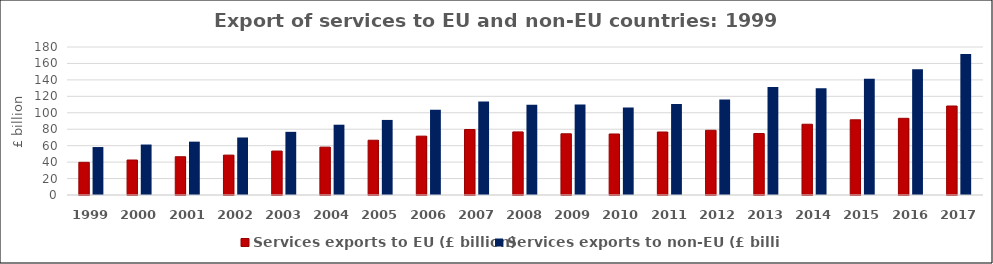
| Category | Services exports to EU (£ billion) | Services exports to non-EU (£ billion) |
|---|---|---|
| 1999.0 | 39.731 | 58.327 |
| 2000.0 | 42.542 | 61.381 |
| 2001.0 | 46.536 | 64.877 |
| 2002.0 | 48.508 | 69.941 |
| 2003.0 | 53.45 | 76.819 |
| 2004.0 | 58.214 | 85.487 |
| 2005.0 | 66.605 | 91.305 |
| 2006.0 | 71.579 | 103.783 |
| 2007.0 | 79.656 | 113.626 |
| 2008.0 | 76.702 | 109.875 |
| 2009.0 | 74.446 | 109.984 |
| 2010.0 | 74.198 | 106.394 |
| 2011.0 | 76.609 | 110.691 |
| 2012.0 | 78.743 | 116.275 |
| 2013.0 | 74.744 | 131.291 |
| 2014.0 | 86.052 | 129.689 |
| 2015.0 | 91.448 | 141.41 |
| 2016.0 | 93.263 | 152.813 |
| 2017.0 | 108.231 | 171.35 |